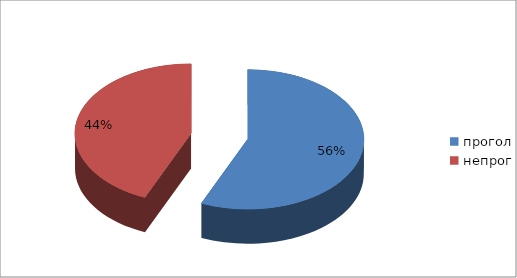
| Category | Series 0 |
|---|---|
| прогол | 100 |
| непрог | 77 |